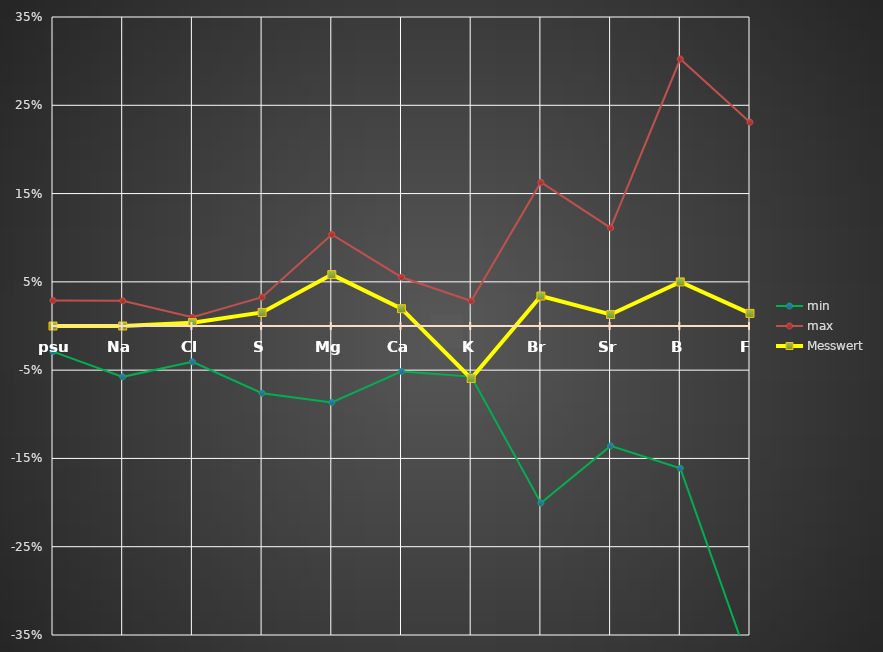
| Category | min | max | Messwert |
|---|---|---|---|
| psu | -0.029 | 0.029 | 0 |
| Na | -0.058 | 0.028 | 0 |
| Cl | -0.041 | 0.01 | 0.004 |
| S | -0.076 | 0.033 | 0.015 |
| Mg | -0.087 | 0.104 | 0.058 |
| Ca | -0.051 | 0.055 | 0.02 |
| K | -0.057 | 0.028 | -0.059 |
| Br | -0.201 | 0.163 | 0.034 |
| Sr | -0.136 | 0.111 | 0.013 |
| B | -0.161 | 0.302 | 0.05 |
| F | -0.385 | 0.231 | 0.014 |